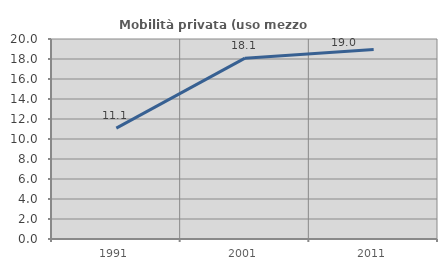
| Category | Mobilità privata (uso mezzo privato) |
|---|---|
| 1991.0 | 11.084 |
| 2001.0 | 18.085 |
| 2011.0 | 18.95 |